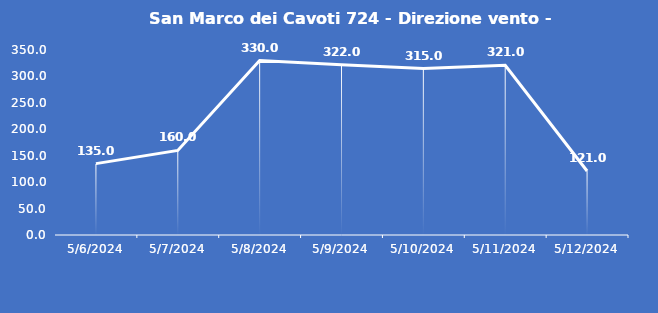
| Category | San Marco dei Cavoti 724 - Direzione vento - Grezzo (°N) |
|---|---|
| 5/6/24 | 135 |
| 5/7/24 | 160 |
| 5/8/24 | 330 |
| 5/9/24 | 322 |
| 5/10/24 | 315 |
| 5/11/24 | 321 |
| 5/12/24 | 121 |